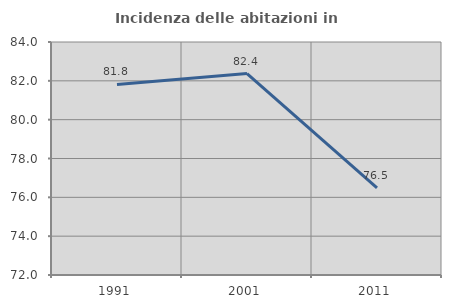
| Category | Incidenza delle abitazioni in proprietà  |
|---|---|
| 1991.0 | 81.815 |
| 2001.0 | 82.373 |
| 2011.0 | 76.491 |